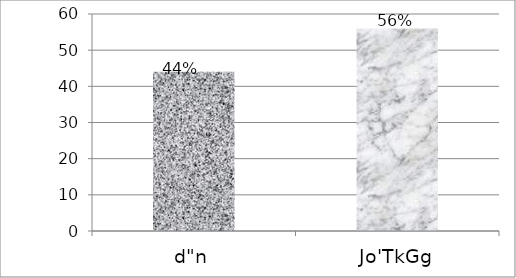
| Category | Series 0 |
|---|---|
| d"n | 44 |
| Jo'TkGg | 56 |